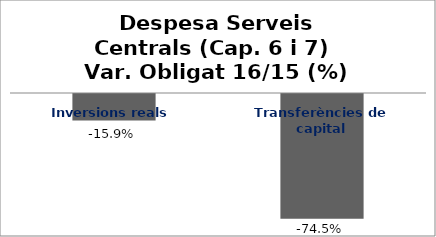
| Category | Series 0 |
|---|---|
| Inversions reals | -0.159 |
| Transferències de capital | -0.745 |